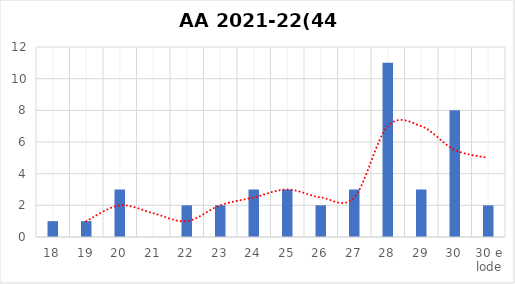
| Category | Series 0 |
|---|---|
| 18 | 1 |
| 19 | 1 |
| 20 | 3 |
| 21 | 0 |
| 22 | 2 |
| 23 | 2 |
| 24 | 3 |
| 25 | 3 |
| 26 | 2 |
| 27 | 3 |
| 28 | 11 |
| 29 | 3 |
| 30 | 8 |
| 30 e lode | 2 |